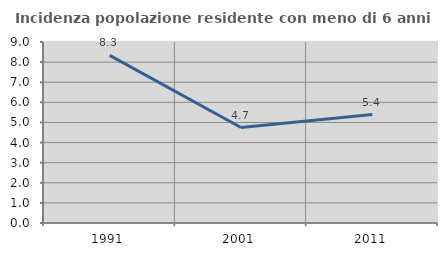
| Category | Incidenza popolazione residente con meno di 6 anni |
|---|---|
| 1991.0 | 8.333 |
| 2001.0 | 4.747 |
| 2011.0 | 5.394 |